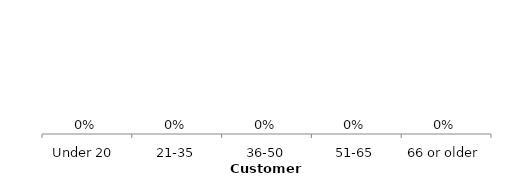
| Category | Series 0 |
|---|---|
| Under 20  | 0 |
| 21-35 | 0 |
| 36-50 | 0 |
| 51-65 | 0 |
| 66 or older | 0 |